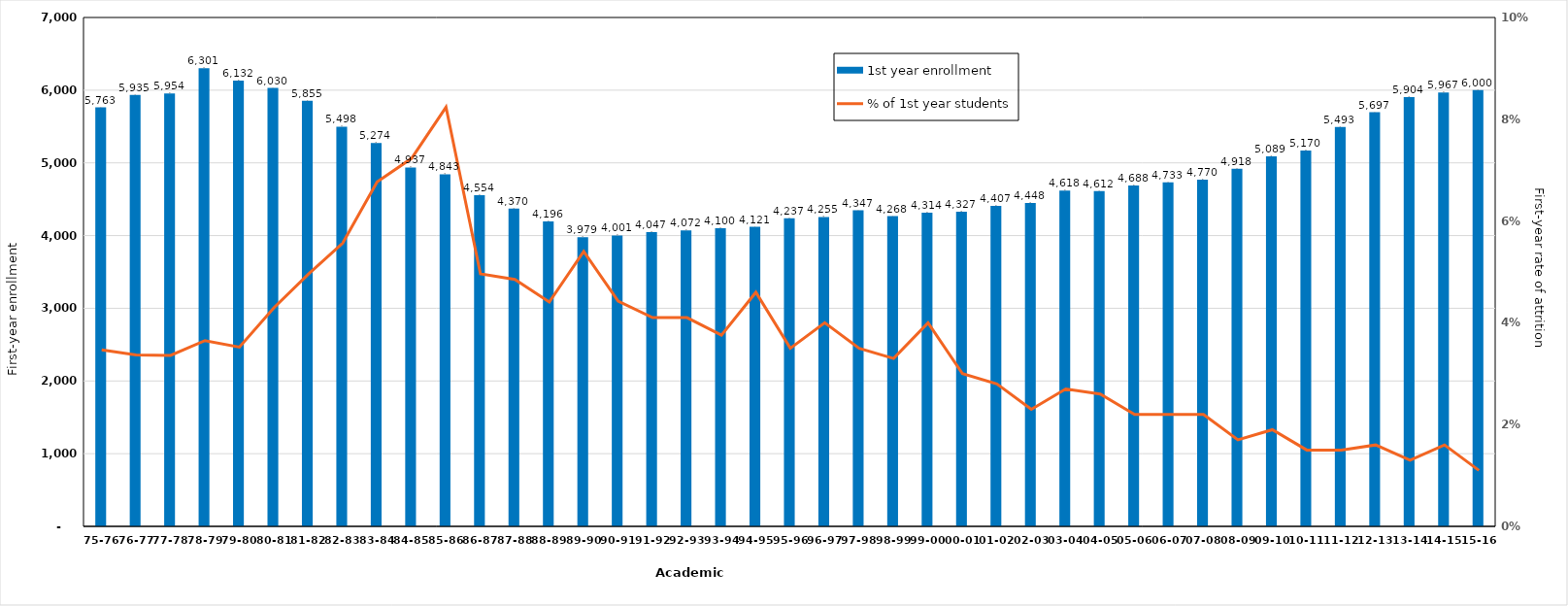
| Category | 1st year enrollment |
|---|---|
| 75-76 | 5763 |
| 76-77 | 5935 |
| 77-78 | 5954 |
| 78-79 | 6301 |
| 79-80 | 6132 |
| 80-81 | 6030 |
| 81-82 | 5855 |
| 82-83 | 5498 |
| 83-84 | 5274 |
| 84-85 | 4937 |
| 85-86 | 4843 |
| 86-87 | 4554 |
| 87-88 | 4370 |
| 88-89 | 4196 |
| 89-90 | 3979 |
| 90-91 | 4001 |
| 91-92 | 4047 |
| 92-93 | 4072 |
| 93-94 | 4100 |
| 94-95 | 4121 |
| 95-96 | 4237 |
| 96-97 | 4255 |
| 97-98 | 4347 |
| 98-99 | 4268 |
| 99-00 | 4314 |
| 00-01 | 4327 |
| 01-02 | 4407 |
| 02-03 | 4448 |
| 03-04 | 4618 |
| 04-05 | 4612 |
| 05-06 | 4688 |
| 06-07 | 4733 |
| 07-08 | 4770 |
| 08-09 | 4918 |
| 09-10 | 5089 |
| 10-11 | 5170 |
| 11-12 | 5493 |
| 12-13 | 5697 |
| 13-14 | 5904 |
| 14-15 | 5967 |
| 15-16 | 6000 |